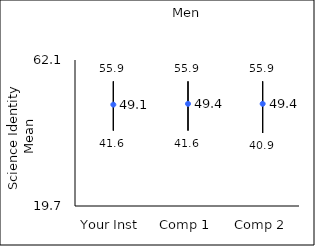
| Category | 25th percentile | 75th percentile | Mean |
|---|---|---|---|
| Your Inst | 41.6 | 55.9 | 49.14 |
| Comp 1 | 41.6 | 55.9 | 49.37 |
| Comp 2 | 40.9 | 55.9 | 49.38 |